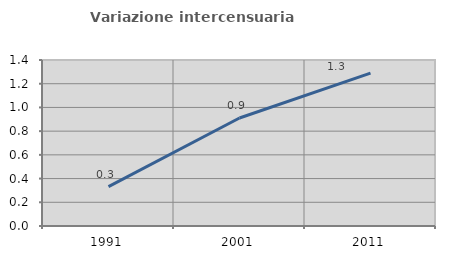
| Category | Variazione intercensuaria annua |
|---|---|
| 1991.0 | 0.332 |
| 2001.0 | 0.911 |
| 2011.0 | 1.289 |